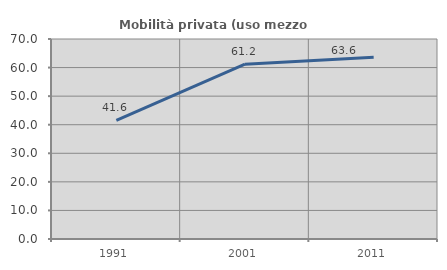
| Category | Mobilità privata (uso mezzo privato) |
|---|---|
| 1991.0 | 41.558 |
| 2001.0 | 61.179 |
| 2011.0 | 63.594 |